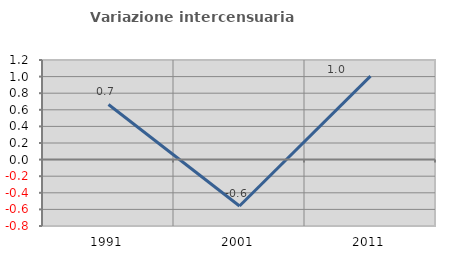
| Category | Variazione intercensuaria annua |
|---|---|
| 1991.0 | 0.664 |
| 2001.0 | -0.559 |
| 2011.0 | 1.005 |